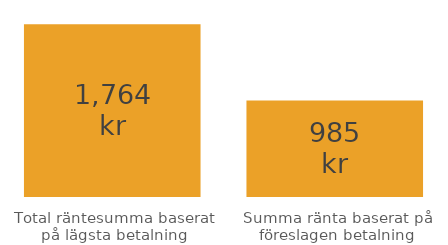
| Category | Series 0 |
|---|---|
| Total räntesumma baserat på lägsta betalning | 1763.952 |
| Summa ränta baserat på föreslagen betalning | 984.811 |